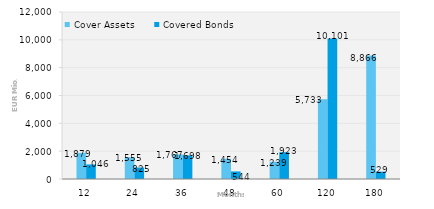
| Category | Cover Assets | Covered Bonds |
|---|---|---|
| 12.0 | 1879.104 | 1046 |
| 24.0 | 1554.924 | 825 |
| 36.0 | 1766.975 | 1697.5 |
| 48.0 | 1453.878 | 544 |
| 60.0 | 1239.293 | 1923.136 |
| 120.0 | 5732.857 | 10101.234 |
| 180.0 | 8865.811 | 528.573 |